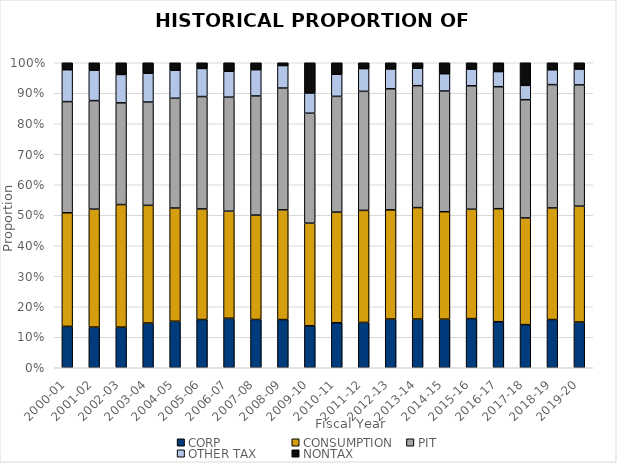
| Category | CORP | CONSUMPTION | PIT | OTHER TAX | NONTAX |
|---|---|---|---|---|---|
| 2000-01 | 0.136 | 0.373 | 0.364 | 0.105 | 0.023 |
| 2001-02 | 0.133 | 0.387 | 0.356 | 0.1 | 0.024 |
| 2002-03 | 0.133 | 0.402 | 0.333 | 0.093 | 0.038 |
| 2003-04 | 0.147 | 0.386 | 0.339 | 0.095 | 0.034 |
| 2004-05 | 0.153 | 0.371 | 0.36 | 0.092 | 0.025 |
| 2005-06 | 0.158 | 0.363 | 0.368 | 0.092 | 0.019 |
| 2006-07 | 0.162 | 0.351 | 0.374 | 0.085 | 0.028 |
| 2007-08 | 0.158 | 0.342 | 0.391 | 0.086 | 0.023 |
| 2008-09 | 0.158 | 0.36 | 0.399 | 0.074 | 0.009 |
| 2009-10 | 0.138 | 0.336 | 0.361 | 0.066 | 0.099 |
| 2010-11 | 0.148 | 0.363 | 0.38 | 0.072 | 0.038 |
| 2011-12 | 0.149 | 0.367 | 0.39 | 0.075 | 0.019 |
| 2012-13 | 0.16 | 0.358 | 0.397 | 0.065 | 0.02 |
| 2013-14 | 0.16 | 0.365 | 0.4 | 0.057 | 0.018 |
| 2014-15 | 0.159 | 0.352 | 0.396 | 0.057 | 0.036 |
| 2015-16 | 0.161 | 0.359 | 0.405 | 0.055 | 0.021 |
| 2016-17 | 0.151 | 0.371 | 0.4 | 0.05 | 0.029 |
| 2017-18 | 0.141 | 0.35 | 0.388 | 0.047 | 0.074 |
| 2018-19 | 0.158 | 0.366 | 0.404 | 0.049 | 0.023 |
| 2019-20 | 0.15 | 0.38 | 0.398 | 0.052 | 0.021 |